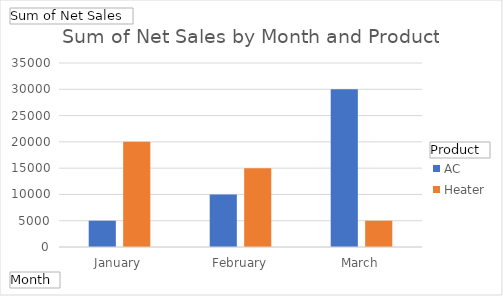
| Category | AC | Heater |
|---|---|---|
| January | 5000 | 20000 |
| February | 10000 | 15000 |
| March | 30000 | 5000 |